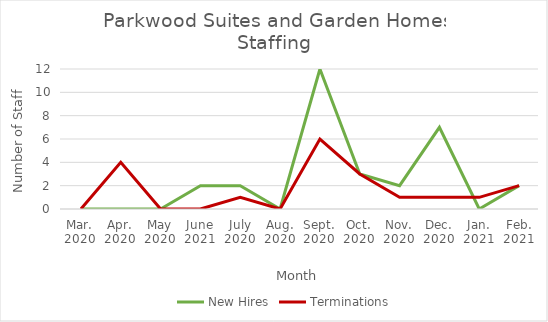
| Category | New Hires | Terminations |
|---|---|---|
| Mar.
2020 | 0 | 0 |
| Apr.
2020 | 0 | 4 |
| May
2020 | 0 | 0 |
| June
2021 | 2 | 0 |
| July
2020 | 2 | 1 |
| Aug.
2020 | 0 | 0 |
| Sept.
2020 | 12 | 6 |
| Oct.
2020 | 3 | 3 |
| Nov.
2020 | 2 | 1 |
| Dec.
2020 | 7 | 1 |
| Jan.
2021 | 0 | 1 |
| Feb.
2021 | 2 | 2 |